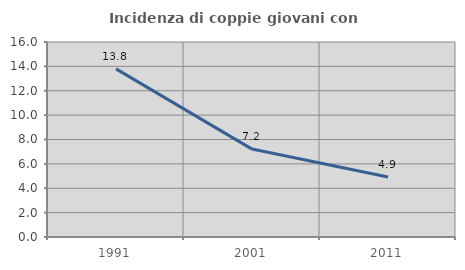
| Category | Incidenza di coppie giovani con figli |
|---|---|
| 1991.0 | 13.793 |
| 2001.0 | 7.213 |
| 2011.0 | 4.918 |